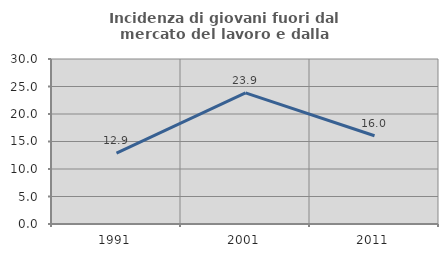
| Category | Incidenza di giovani fuori dal mercato del lavoro e dalla formazione  |
|---|---|
| 1991.0 | 12.903 |
| 2001.0 | 23.853 |
| 2011.0 | 16.041 |